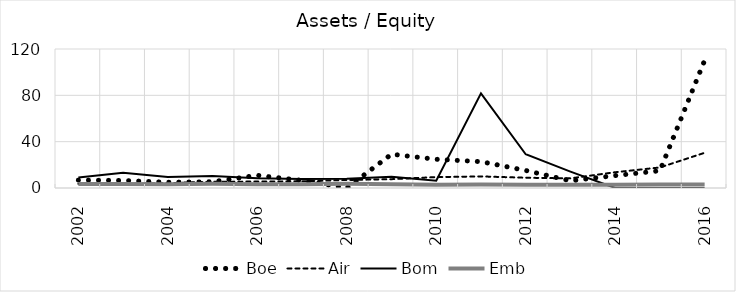
| Category | Boe | Air | Bom | Emb |
|---|---|---|---|---|
| 2002.0 | 6.8 | 3.62 | 8.97 | 3.38 |
| 2003.0 | 6.51 | 3.37 | 13.2 | 3.44 |
| 2004.0 | 4.98 | 4.2 | 9.42 | 3.21 |
| 2005.0 | 5.43 | 5.42 | 10.32 | 3.58 |
| 2006.0 | 10.93 | 5.54 | 8.41 | 3.23 |
| 2007.0 | 6.55 | 5.76 | 7.79 | 3.34 |
| 2008.0 | 0 | 6.91 | 7.98 | 3.6 |
| 2009.0 | 29.16 | 7.62 | 9.7 | 3.18 |
| 2010.0 | 24.79 | 9.41 | 6.34 | 2.77 |
| 2011.0 | 22.76 | 10 | 81.73 | 2.94 |
| 2012.0 | 15.15 | 8.86 | 29.14 | 2.91 |
| 2013.0 | 6.23 | 8.31 | 14.12 | 2.87 |
| 2014.0 | 10.72 | 13.61 | 0 | 2.77 |
| 2015.0 | 14.9 | 17.73 | 0 | 3.12 |
| 2016.0 | 110.16 | 30.39 | 0 | 3.03 |